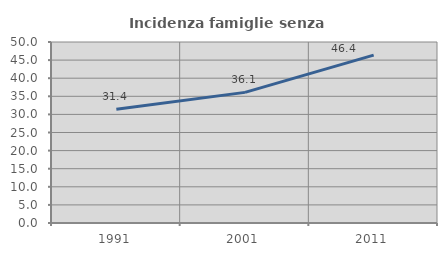
| Category | Incidenza famiglie senza nuclei |
|---|---|
| 1991.0 | 31.429 |
| 2001.0 | 36.084 |
| 2011.0 | 46.386 |